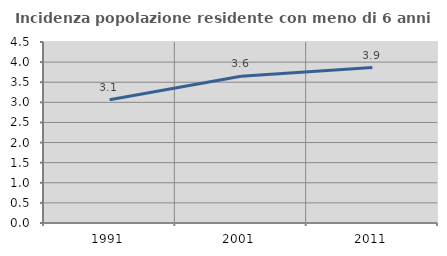
| Category | Incidenza popolazione residente con meno di 6 anni |
|---|---|
| 1991.0 | 3.063 |
| 2001.0 | 3.647 |
| 2011.0 | 3.864 |